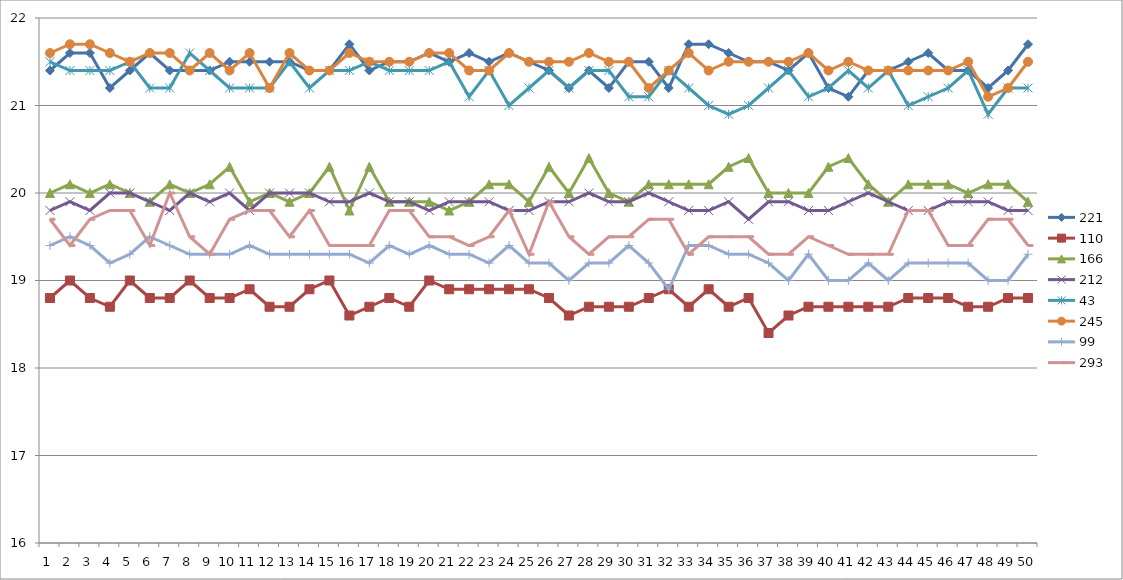
| Category | 221 | 110 | 166 | 212 | 43 | 245 | 99 | 293 |
|---|---|---|---|---|---|---|---|---|
| 0 | 21.4 | 18.8 | 20 | 19.8 | 21.5 | 21.6 | 19.4 | 19.7 |
| 1 | 21.6 | 19 | 20.1 | 19.9 | 21.4 | 21.7 | 19.5 | 19.4 |
| 2 | 21.6 | 18.8 | 20 | 19.8 | 21.4 | 21.7 | 19.4 | 19.7 |
| 3 | 21.2 | 18.7 | 20.1 | 20 | 21.4 | 21.6 | 19.2 | 19.8 |
| 4 | 21.4 | 19 | 20 | 20 | 21.5 | 21.5 | 19.3 | 19.8 |
| 5 | 21.6 | 18.8 | 19.9 | 19.9 | 21.2 | 21.6 | 19.5 | 19.4 |
| 6 | 21.4 | 18.8 | 20.1 | 19.8 | 21.2 | 21.6 | 19.4 | 20 |
| 7 | 21.4 | 19 | 20 | 20 | 21.6 | 21.4 | 19.3 | 19.5 |
| 8 | 21.4 | 18.8 | 20.1 | 19.9 | 21.4 | 21.6 | 19.3 | 19.3 |
| 9 | 21.5 | 18.8 | 20.3 | 20 | 21.2 | 21.4 | 19.3 | 19.7 |
| 10 | 21.5 | 18.9 | 19.9 | 19.8 | 21.2 | 21.6 | 19.4 | 19.8 |
| 11 | 21.5 | 18.7 | 20 | 20 | 21.2 | 21.2 | 19.3 | 19.8 |
| 12 | 21.5 | 18.7 | 19.9 | 20 | 21.5 | 21.6 | 19.3 | 19.5 |
| 13 | 21.4 | 18.9 | 20 | 20 | 21.2 | 21.4 | 19.3 | 19.8 |
| 14 | 21.4 | 19 | 20.3 | 19.9 | 21.4 | 21.4 | 19.3 | 19.4 |
| 15 | 21.7 | 18.6 | 19.8 | 19.9 | 21.4 | 21.6 | 19.3 | 19.4 |
| 16 | 21.4 | 18.7 | 20.3 | 20 | 21.5 | 21.5 | 19.2 | 19.4 |
| 17 | 21.5 | 18.8 | 19.9 | 19.9 | 21.4 | 21.5 | 19.4 | 19.8 |
| 18 | 21.5 | 18.7 | 19.9 | 19.9 | 21.4 | 21.5 | 19.3 | 19.8 |
| 19 | 21.6 | 19 | 19.9 | 19.8 | 21.4 | 21.6 | 19.4 | 19.5 |
| 20 | 21.5 | 18.9 | 19.8 | 19.9 | 21.5 | 21.6 | 19.3 | 19.5 |
| 21 | 21.6 | 18.9 | 19.9 | 19.9 | 21.1 | 21.4 | 19.3 | 19.4 |
| 22 | 21.5 | 18.9 | 20.1 | 19.9 | 21.4 | 21.4 | 19.2 | 19.5 |
| 23 | 21.6 | 18.9 | 20.1 | 19.8 | 21 | 21.6 | 19.4 | 19.8 |
| 24 | 21.5 | 18.9 | 19.9 | 19.8 | 21.2 | 21.5 | 19.2 | 19.3 |
| 25 | 21.4 | 18.8 | 20.3 | 19.9 | 21.4 | 21.5 | 19.2 | 19.9 |
| 26 | 21.2 | 18.6 | 20 | 19.9 | 21.2 | 21.5 | 19 | 19.5 |
| 27 | 21.4 | 18.7 | 20.4 | 20 | 21.4 | 21.6 | 19.2 | 19.3 |
| 28 | 21.2 | 18.7 | 20 | 19.9 | 21.4 | 21.5 | 19.2 | 19.5 |
| 29 | 21.5 | 18.7 | 19.9 | 19.9 | 21.1 | 21.5 | 19.4 | 19.5 |
| 30 | 21.5 | 18.8 | 20.1 | 20 | 21.1 | 21.2 | 19.2 | 19.7 |
| 31 | 21.2 | 18.9 | 20.1 | 19.9 | 21.4 | 21.4 | 18.9 | 19.7 |
| 32 | 21.7 | 18.7 | 20.1 | 19.8 | 21.2 | 21.6 | 19.4 | 19.3 |
| 33 | 21.7 | 18.9 | 20.1 | 19.8 | 21 | 21.4 | 19.4 | 19.5 |
| 34 | 21.6 | 18.7 | 20.3 | 19.9 | 20.9 | 21.5 | 19.3 | 19.5 |
| 35 | 21.5 | 18.8 | 20.4 | 19.7 | 21 | 21.5 | 19.3 | 19.5 |
| 36 | 21.5 | 18.4 | 20 | 19.9 | 21.2 | 21.5 | 19.2 | 19.3 |
| 37 | 21.4 | 18.6 | 20 | 19.9 | 21.4 | 21.5 | 19 | 19.3 |
| 38 | 21.6 | 18.7 | 20 | 19.8 | 21.1 | 21.6 | 19.3 | 19.5 |
| 39 | 21.2 | 18.7 | 20.3 | 19.8 | 21.2 | 21.4 | 19 | 19.4 |
| 40 | 21.1 | 18.7 | 20.4 | 19.9 | 21.4 | 21.5 | 19 | 19.3 |
| 41 | 21.4 | 18.7 | 20.1 | 20 | 21.2 | 21.4 | 19.2 | 19.3 |
| 42 | 21.4 | 18.7 | 19.9 | 19.9 | 21.4 | 21.4 | 19 | 19.3 |
| 43 | 21.5 | 18.8 | 20.1 | 19.8 | 21 | 21.4 | 19.2 | 19.8 |
| 44 | 21.6 | 18.8 | 20.1 | 19.8 | 21.1 | 21.4 | 19.2 | 19.8 |
| 45 | 21.4 | 18.8 | 20.1 | 19.9 | 21.2 | 21.4 | 19.2 | 19.4 |
| 46 | 21.4 | 18.7 | 20 | 19.9 | 21.4 | 21.5 | 19.2 | 19.4 |
| 47 | 21.2 | 18.7 | 20.1 | 19.9 | 20.9 | 21.1 | 19 | 19.7 |
| 48 | 21.4 | 18.8 | 20.1 | 19.8 | 21.2 | 21.2 | 19 | 19.7 |
| 49 | 21.7 | 18.8 | 19.9 | 19.8 | 21.2 | 21.5 | 19.3 | 19.4 |